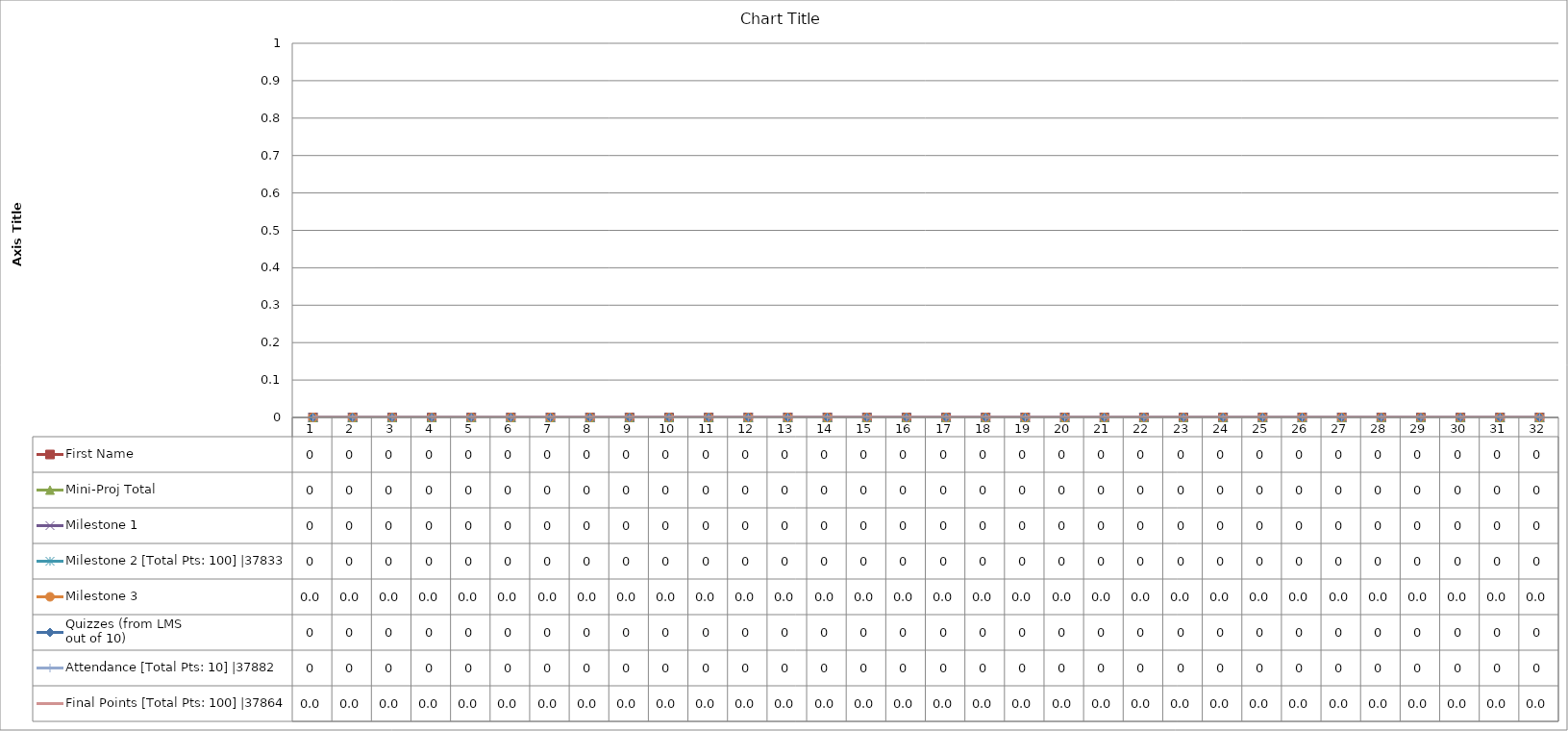
| Category | First Name | Mini-Proj Total | Milestone 1 | Milestone 2 [Total Pts: 100] |37833 | Milestone 3 | Quizzes (from LMS
out of 10) | Attendance [Total Pts: 10] |37882 | Final Points [Total Pts: 100] |37864 |
|---|---|---|---|---|---|---|---|---|
| 0 | 0 | 0 | 0 | 0 | 0 | 0 | 0 | 0 |
| 1 | 0 | 0 | 0 | 0 | 0 | 0 | 0 | 0 |
| 2 | 0 | 0 | 0 | 0 | 0 | 0 | 0 | 0 |
| 3 | 0 | 0 | 0 | 0 | 0 | 0 | 0 | 0 |
| 4 | 0 | 0 | 0 | 0 | 0 | 0 | 0 | 0 |
| 5 | 0 | 0 | 0 | 0 | 0 | 0 | 0 | 0 |
| 6 | 0 | 0 | 0 | 0 | 0 | 0 | 0 | 0 |
| 7 | 0 | 0 | 0 | 0 | 0 | 0 | 0 | 0 |
| 8 | 0 | 0 | 0 | 0 | 0 | 0 | 0 | 0 |
| 9 | 0 | 0 | 0 | 0 | 0 | 0 | 0 | 0 |
| 10 | 0 | 0 | 0 | 0 | 0 | 0 | 0 | 0 |
| 11 | 0 | 0 | 0 | 0 | 0 | 0 | 0 | 0 |
| 12 | 0 | 0 | 0 | 0 | 0 | 0 | 0 | 0 |
| 13 | 0 | 0 | 0 | 0 | 0 | 0 | 0 | 0 |
| 14 | 0 | 0 | 0 | 0 | 0 | 0 | 0 | 0 |
| 15 | 0 | 0 | 0 | 0 | 0 | 0 | 0 | 0 |
| 16 | 0 | 0 | 0 | 0 | 0 | 0 | 0 | 0 |
| 17 | 0 | 0 | 0 | 0 | 0 | 0 | 0 | 0 |
| 18 | 0 | 0 | 0 | 0 | 0 | 0 | 0 | 0 |
| 19 | 0 | 0 | 0 | 0 | 0 | 0 | 0 | 0 |
| 20 | 0 | 0 | 0 | 0 | 0 | 0 | 0 | 0 |
| 21 | 0 | 0 | 0 | 0 | 0 | 0 | 0 | 0 |
| 22 | 0 | 0 | 0 | 0 | 0 | 0 | 0 | 0 |
| 23 | 0 | 0 | 0 | 0 | 0 | 0 | 0 | 0 |
| 24 | 0 | 0 | 0 | 0 | 0 | 0 | 0 | 0 |
| 25 | 0 | 0 | 0 | 0 | 0 | 0 | 0 | 0 |
| 26 | 0 | 0 | 0 | 0 | 0 | 0 | 0 | 0 |
| 27 | 0 | 0 | 0 | 0 | 0 | 0 | 0 | 0 |
| 28 | 0 | 0 | 0 | 0 | 0 | 0 | 0 | 0 |
| 29 | 0 | 0 | 0 | 0 | 0 | 0 | 0 | 0 |
| 30 | 0 | 0 | 0 | 0 | 0 | 0 | 0 | 0 |
| 31 | 0 | 0 | 0 | 0 | 0 | 0 | 0 | 0 |